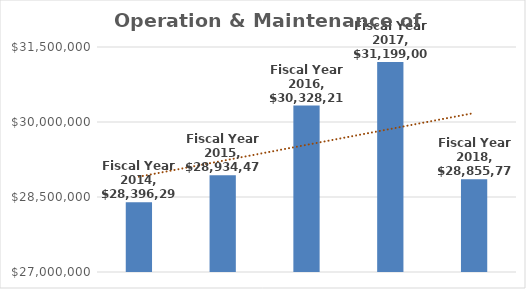
| Category | Operation & Maintenance of Plant |
|---|---|
| Fiscal Year 2014 | 28396299 |
| Fiscal Year 2015 | 28934472 |
| Fiscal Year 2016 | 30328211 |
| Fiscal Year 2017 | 31199005 |
| Fiscal Year 2018 | 28855774 |